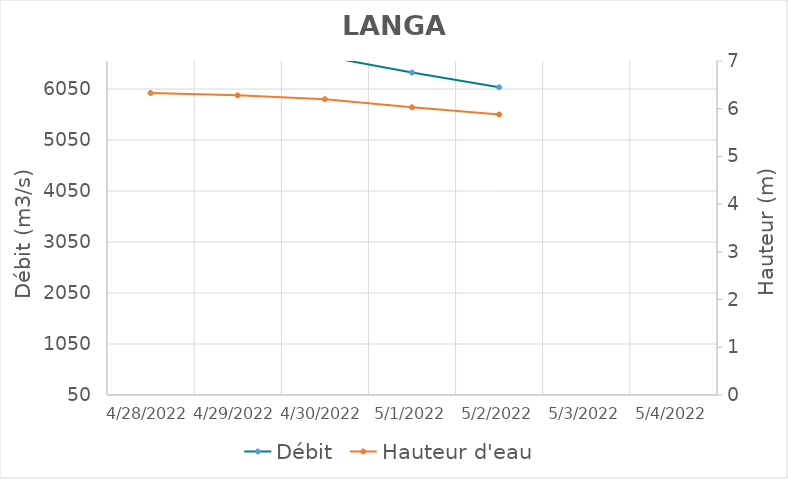
| Category | Débit |
|---|---|
| 4/26/22 | 6357.44 |
| 4/25/22 | 6275.1 |
| 4/24/22 | 6196.88 |
| 4/23/22 | 5912.5 |
| 4/22/22 | 5801.88 |
| 4/21/22 | 4763.75 |
| 4/20/22 | 4718.96 |